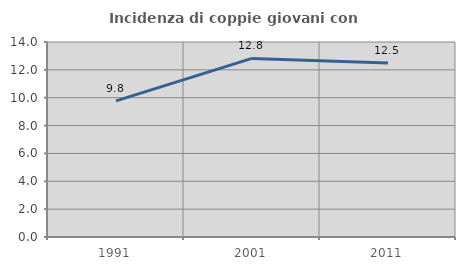
| Category | Incidenza di coppie giovani con figli |
|---|---|
| 1991.0 | 9.77 |
| 2001.0 | 12.821 |
| 2011.0 | 12.5 |